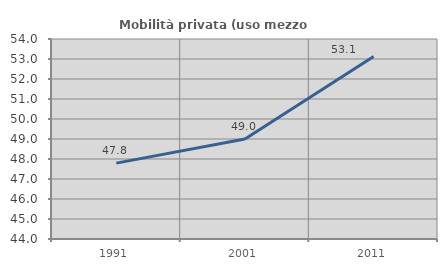
| Category | Mobilità privata (uso mezzo privato) |
|---|---|
| 1991.0 | 47.794 |
| 2001.0 | 49 |
| 2011.0 | 53.125 |